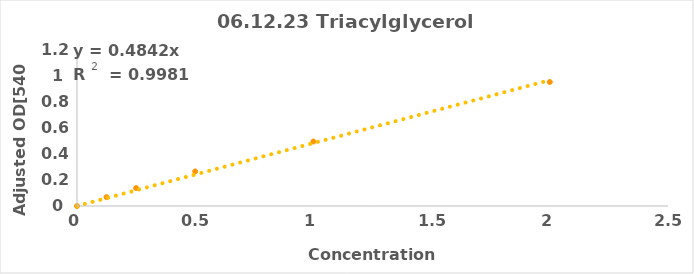
| Category | Series 0 |
|---|---|
| 0.0 | 0 |
| 0.125 | 0.068 |
| 0.25 | 0.138 |
| 0.5 | 0.266 |
| 1.0 | 0.496 |
| 2.0 | 0.954 |